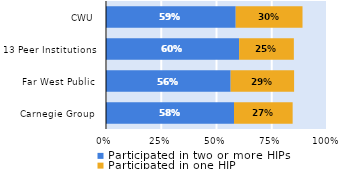
| Category | Participated in two or more HIPs | Participated in one HIP |
|---|---|---|
| Carnegie Group | 0.579 | 0.265 |
| Far West Public | 0.564 | 0.287 |
| 13 Peer Institutions | 0.602 | 0.248 |
| CWU | 0.587 | 0.302 |